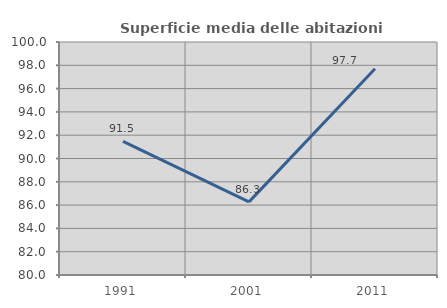
| Category | Superficie media delle abitazioni occupate |
|---|---|
| 1991.0 | 91.478 |
| 2001.0 | 86.275 |
| 2011.0 | 97.703 |